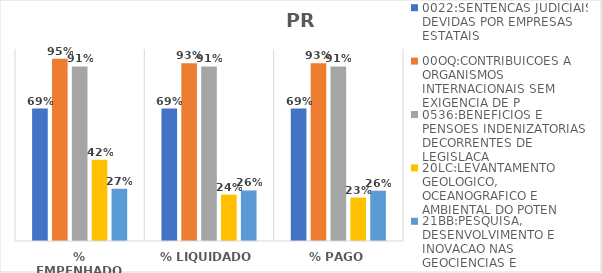
| Category | 0022:SENTENCAS JUDICIAIS DEVIDAS POR EMPRESAS ESTATAIS | 00OQ:CONTRIBUICOES A ORGANISMOS INTERNACIONAIS SEM EXIGENCIA DE P | 0536:BENEFICIOS E PENSOES INDENIZATORIAS DECORRENTES DE LEGISLACA | 20LC:LEVANTAMENTO GEOLOGICO, OCEANOGRAFICO E AMBIENTAL DO POTEN | 21BB:PESQUISA, DESENVOLVIMENTO E INOVACAO NAS GEOCIENCIAS E |
|---|---|---|---|---|---|
| % EMPENHADO | 0.69 | 0.95 | 0.909 | 0.423 | 0.273 |
| % LIQUIDADO | 0.69 | 0.926 | 0.909 | 0.242 | 0.263 |
| % PAGO | 0.69 | 0.926 | 0.909 | 0.226 | 0.262 |